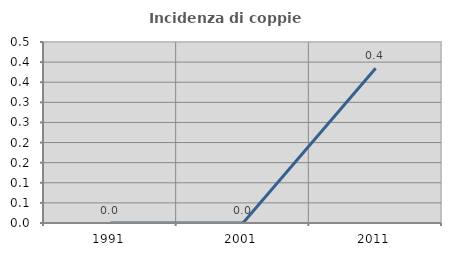
| Category | Incidenza di coppie miste |
|---|---|
| 1991.0 | 0 |
| 2001.0 | 0 |
| 2011.0 | 0.385 |